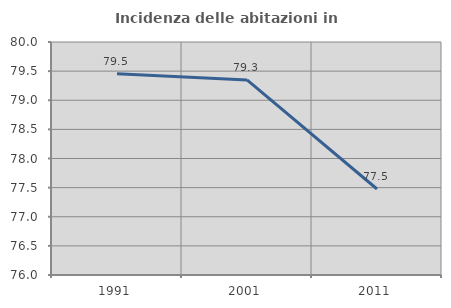
| Category | Incidenza delle abitazioni in proprietà  |
|---|---|
| 1991.0 | 79.454 |
| 2001.0 | 79.349 |
| 2011.0 | 77.476 |